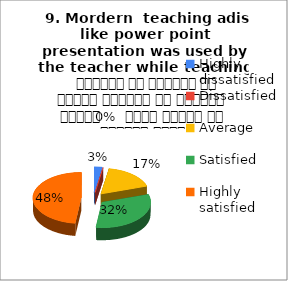
| Category |  9. Mordern  teaching adis like power point presentation was used by the teacher while teaching     शिक्षक ने शिक्षण के दौरान शिक्षण की आधुनिक तकनीक     पावर पॉइंट का प्रयोग किया |
|---|---|
| Highly dissatisfied | 2 |
| Dissatisfied | 0 |
| Average | 13 |
| Satisfied | 24 |
| Highly satisfied | 36 |